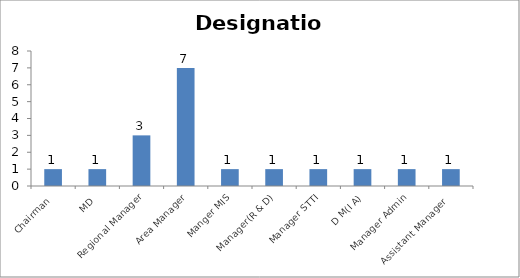
| Category | Designation |
|---|---|
| Chairman | 1 |
| MD | 1 |
| Regional Manager | 3 |
| Area Manager | 7 |
| Manger MIS | 1 |
| Manager(R & D) | 1 |
| Manager STTI | 1 |
| D M(I A) | 1 |
| Manager Admin | 1 |
| Assistant Manager  | 1 |